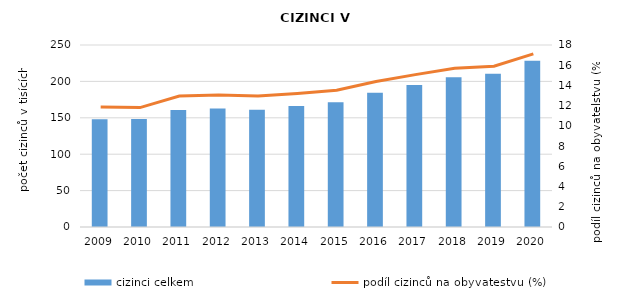
| Category | cizinci celkem |
|---|---|
| 2009.0 | 148123 |
| 2010.0 | 148447 |
| 2011.0 | 160783 |
| 2012.0 | 162715 |
| 2013.0 | 161006 |
| 2014.0 | 166332 |
| 2015.0 | 171408 |
| 2016.0 | 184264 |
| 2017.0 | 195068 |
| 2018.0 | 205595 |
| 2019.0 | 210483 |
| 2020.0 | 228532 |